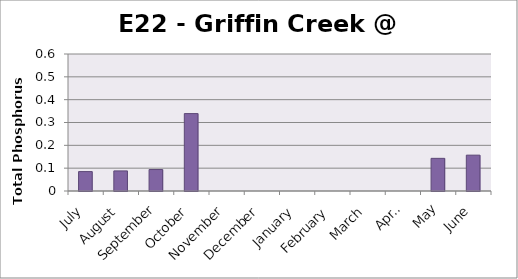
| Category | Phosphorus (mg/L) |
|---|---|
| July | 0.085 |
| August | 0.088 |
| September | 0.094 |
| October | 0.339 |
| November | 0 |
| December | 0 |
| January | 0 |
| February | 0 |
| March | 0 |
| April | 0 |
| May | 0.143 |
| June | 0.157 |